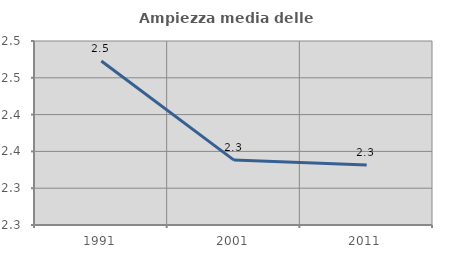
| Category | Ampiezza media delle famiglie |
|---|---|
| 1991.0 | 2.473 |
| 2001.0 | 2.338 |
| 2011.0 | 2.331 |